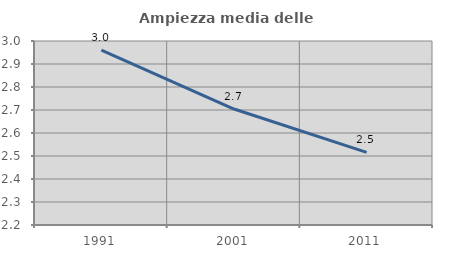
| Category | Ampiezza media delle famiglie |
|---|---|
| 1991.0 | 2.961 |
| 2001.0 | 2.704 |
| 2011.0 | 2.516 |